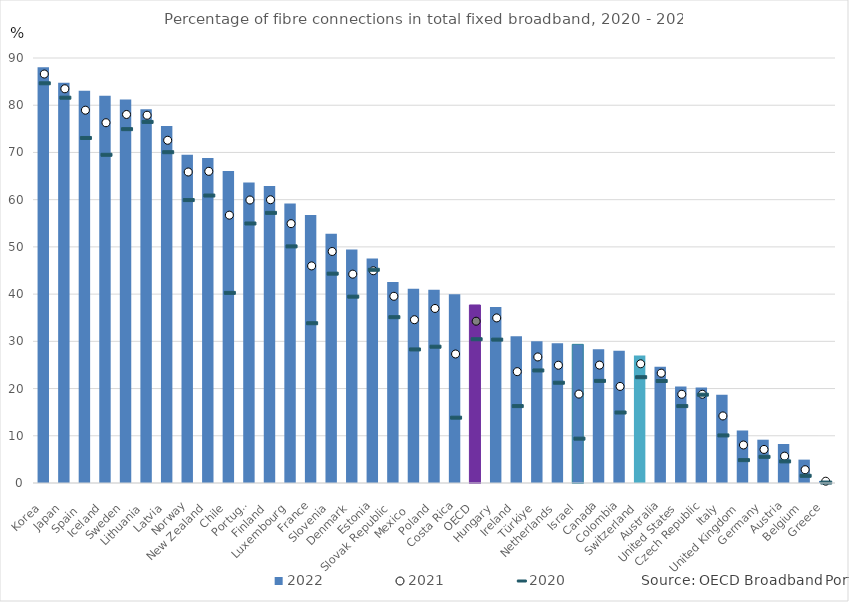
| Category | 2022 |
|---|---|
| Korea | 88.04 |
| Japan | 84.77 |
| Spain  | 83.09 |
| Iceland | 82.01 |
| Sweden | 81.22 |
| Lithuania | 79.14 |
| Latvia | 75.59 |
| Norway | 69.5 |
| New Zealand | 68.83 |
| Chile | 66.05 |
| Portugal | 63.61 |
| Finland | 62.88 |
| Luxembourg | 59.19 |
| France | 56.73 |
| Slovenia | 52.76 |
| Denmark | 49.46 |
| Estonia | 47.53 |
| Slovak Republic | 42.56 |
| Mexico  | 41.13 |
| Poland | 40.95 |
| Costa Rica | 39.95 |
| OECD | 37.7 |
| Hungary | 37.29 |
| Ireland | 31.08 |
| Türkiye | 30.02 |
| Netherlands | 29.62 |
| Israel | 29.36 |
| Canada | 28.3 |
| Colombia | 27.99 |
| Switzerland | 26.98 |
| Australia | 24.61 |
| United States | 20.44 |
| Czech Republic | 20.21 |
| Italy | 18.67 |
| United Kingdom | 11.12 |
| Germany | 9.17 |
| Austria | 8.26 |
| Belgium | 4.95 |
| Greece | 0.44 |